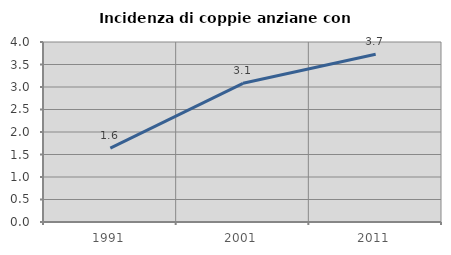
| Category | Incidenza di coppie anziane con figli |
|---|---|
| 1991.0 | 1.641 |
| 2001.0 | 3.081 |
| 2011.0 | 3.726 |